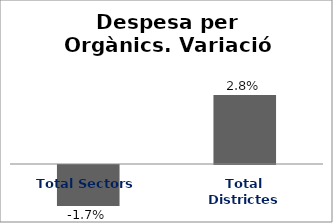
| Category | Series 0 |
|---|---|
| Total Sectors | -0.017 |
| Total Districtes | 0.028 |